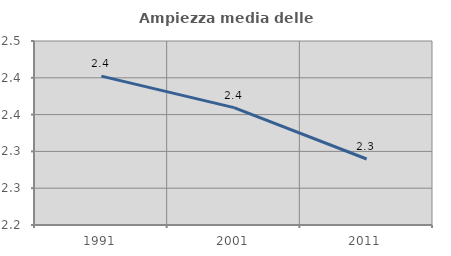
| Category | Ampiezza media delle famiglie |
|---|---|
| 1991.0 | 2.402 |
| 2001.0 | 2.359 |
| 2011.0 | 2.29 |